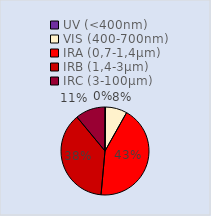
| Category | Series 0 |
|---|---|
| UV (<400nm) | 0.002 |
| VIS (400-700nm) | 0.08 |
| IRA (0,7-1,4µm) | 0.433 |
| IRB (1,4-3µm) | 0.376 |
| IRC (3-100µm) | 0.11 |